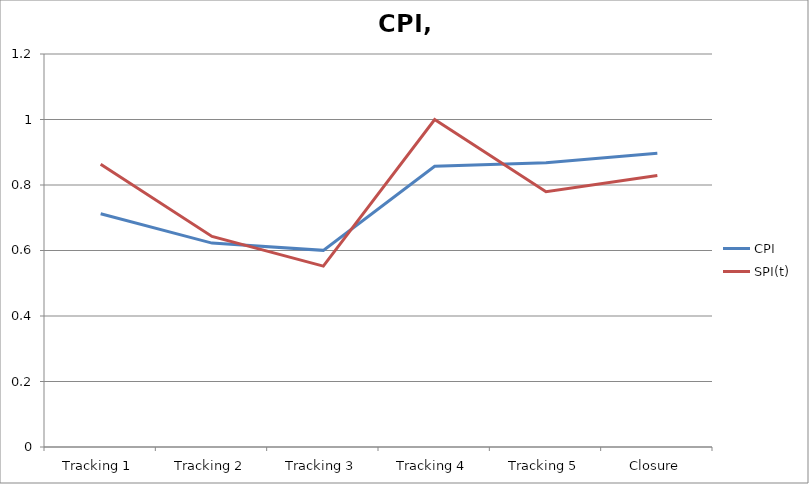
| Category | CPI | SPI(t) |
|---|---|---|
| Tracking 1 | 0.712 | 0.864 |
| Tracking 2 | 0.623 | 0.643 |
| Tracking 3 | 0.6 | 0.552 |
| Tracking 4 | 0.857 | 1 |
| Tracking 5 | 0.868 | 0.779 |
| Closure | 0.897 | 0.829 |